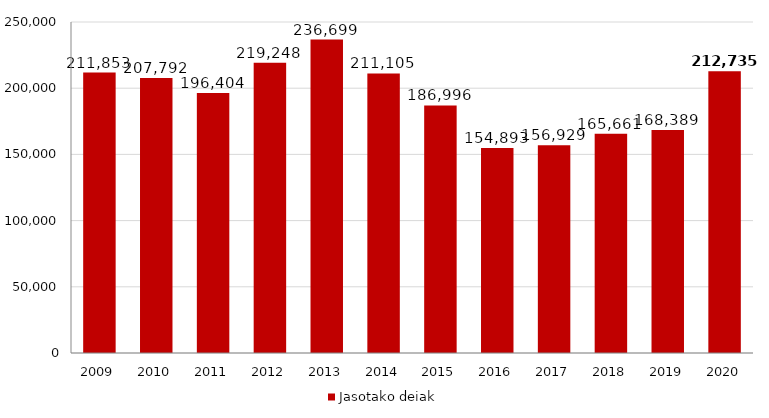
| Category | Jasotako deiak |
|---|---|
| 2009.0 | 211853 |
| 2010.0 | 207792 |
| 2011.0 | 196404 |
| 2012.0 | 219248 |
| 2013.0 | 236699 |
| 2014.0 | 211105 |
| 2015.0 | 186996 |
| 2016.0 | 154893 |
| 2017.0 | 156929 |
| 2018.0 | 165661 |
| 2019.0 | 168389 |
| 2020.0 | 212735 |